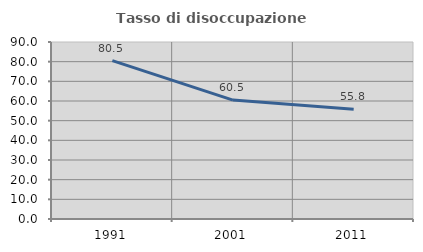
| Category | Tasso di disoccupazione giovanile  |
|---|---|
| 1991.0 | 80.503 |
| 2001.0 | 60.464 |
| 2011.0 | 55.775 |